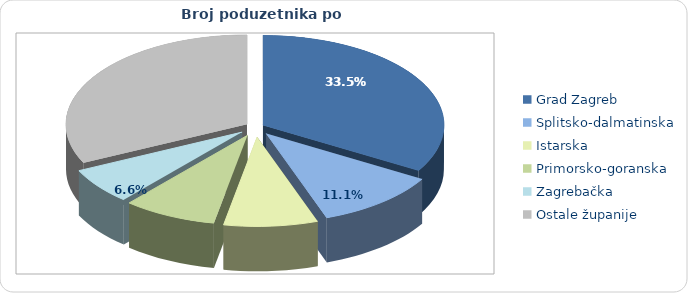
| Category | Broj poduzetnika |
|---|---|
| Grad Zagreb | 43927 |
| Splitsko-dalmatinska | 14518 |
| Istarska | 11006 |
| Primorsko-goranska | 10974 |
| Zagrebačka | 8589 |
| Ostale županije | 42103 |